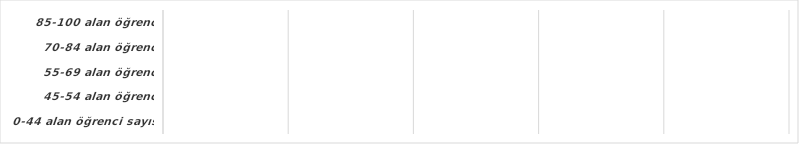
| Category | Series 6 |
|---|---|
| 0-44 alan öğrenci sayısı | 0 |
| 45-54 alan öğrenci sayısı | 0 |
| 55-69 alan öğrenci sayısı | 0 |
| 70-84 alan öğrenci sayısı | 0 |
| 85-100 alan öğrenci sayısı | 0 |